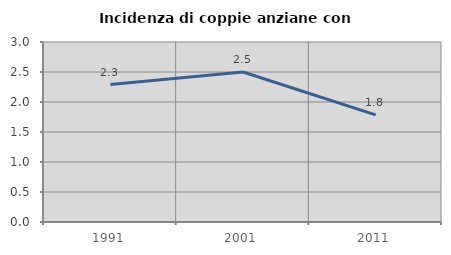
| Category | Incidenza di coppie anziane con figli |
|---|---|
| 1991.0 | 2.29 |
| 2001.0 | 2.5 |
| 2011.0 | 1.786 |